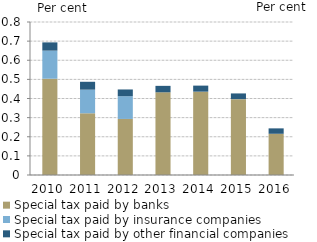
| Category | Special tax paid by banks | Special tax paid by insurance companies | Special tax paid by other financial companies |
|---|---|---|---|
| 2010-01-01 | 0.503 | 0.147 | 0.043 |
| 2011-01-01 | 0.323 | 0.124 | 0.041 |
| 2012-01-01 | 0.293 | 0.119 | 0.035 |
| 2013-01-01 | 0.432 | 0 | 0.034 |
| 2014-01-01 | 0.436 | 0 | 0.032 |
| 2015-01-01 | 0.397 | 0 | 0.03 |
| 2016-01-01 | 0.216 | 0 | 0.028 |